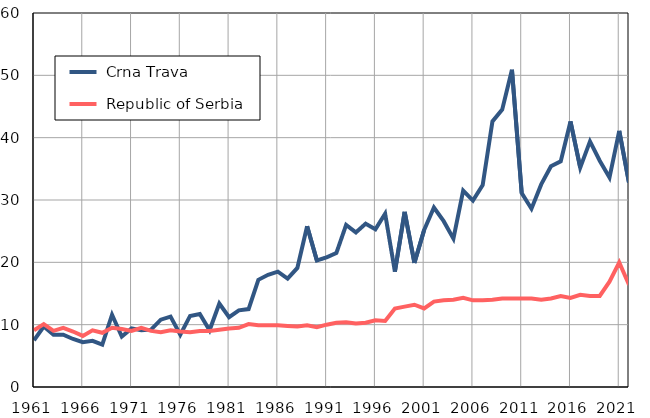
| Category |  Crna Trava |  Republic of Serbia |
|---|---|---|
| 1961.0 | 7.5 | 9.1 |
| 1962.0 | 9.7 | 10.1 |
| 1963.0 | 8.4 | 9 |
| 1964.0 | 8.4 | 9.5 |
| 1965.0 | 7.7 | 8.9 |
| 1966.0 | 7.2 | 8.2 |
| 1967.0 | 7.4 | 9.1 |
| 1968.0 | 6.8 | 8.7 |
| 1969.0 | 11.6 | 9.5 |
| 1970.0 | 8.1 | 9.3 |
| 1971.0 | 9.4 | 9 |
| 1972.0 | 9.1 | 9.5 |
| 1973.0 | 9.2 | 9 |
| 1974.0 | 10.8 | 8.8 |
| 1975.0 | 11.3 | 9.1 |
| 1976.0 | 8.4 | 8.9 |
| 1977.0 | 11.4 | 8.8 |
| 1978.0 | 11.7 | 9 |
| 1979.0 | 9.1 | 9 |
| 1980.0 | 13.4 | 9.2 |
| 1981.0 | 11.2 | 9.4 |
| 1982.0 | 12.3 | 9.5 |
| 1983.0 | 12.5 | 10.1 |
| 1984.0 | 17.2 | 9.9 |
| 1985.0 | 18 | 9.9 |
| 1986.0 | 18.5 | 9.9 |
| 1987.0 | 17.4 | 9.8 |
| 1988.0 | 19.1 | 9.7 |
| 1989.0 | 25.8 | 9.9 |
| 1990.0 | 20.3 | 9.6 |
| 1991.0 | 20.8 | 10 |
| 1992.0 | 21.5 | 10.3 |
| 1993.0 | 26 | 10.4 |
| 1994.0 | 24.8 | 10.2 |
| 1995.0 | 26.2 | 10.3 |
| 1996.0 | 25.3 | 10.7 |
| 1997.0 | 27.8 | 10.6 |
| 1998.0 | 18.5 | 12.6 |
| 1999.0 | 28.1 | 12.9 |
| 2000.0 | 19.9 | 13.2 |
| 2001.0 | 25.2 | 12.6 |
| 2002.0 | 28.8 | 13.7 |
| 2003.0 | 26.6 | 13.9 |
| 2004.0 | 23.8 | 14 |
| 2005.0 | 31.5 | 14.3 |
| 2006.0 | 29.9 | 13.9 |
| 2007.0 | 32.4 | 13.9 |
| 2008.0 | 42.6 | 14 |
| 2009.0 | 44.5 | 14.2 |
| 2010.0 | 50.9 | 14.2 |
| 2011.0 | 31.1 | 14.2 |
| 2012.0 | 28.6 | 14.2 |
| 2013.0 | 32.5 | 14 |
| 2014.0 | 35.4 | 14.2 |
| 2015.0 | 36.2 | 14.6 |
| 2016.0 | 42.6 | 14.3 |
| 2017.0 | 35.2 | 14.8 |
| 2018.0 | 39.4 | 14.6 |
| 2019.0 | 36.3 | 14.6 |
| 2020.0 | 33.6 | 16.9 |
| 2021.0 | 41.1 | 20 |
| 2022.0 | 32.8 | 16.4 |